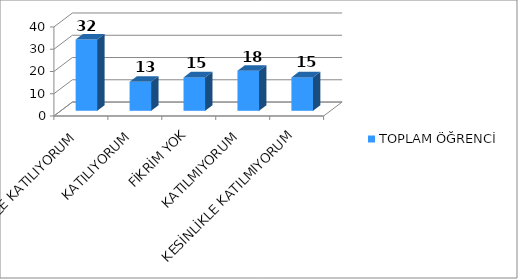
| Category | TOPLAM ÖĞRENCİ |
|---|---|
| KESİNLİKLE KATILIYORUM | 32 |
| KATILIYORUM | 13 |
| FİKRİM YOK | 15 |
| KATILMIYORUM | 18 |
| KESİNLİKLE KATILMIYORUM | 15 |